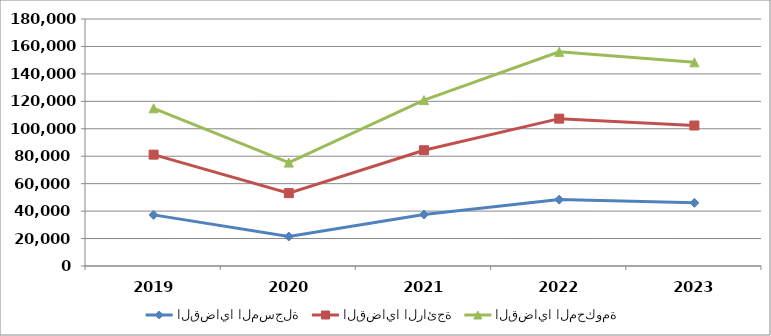
| Category | القضايا المسجلة | القضايا الرائجة | القضايا المحكومة |
|---|---|---|---|
| 2019.0 | 37260 | 43895 | 33755 |
| 2020.0 | 21485 | 31625 | 22248 |
| 2021.0 | 37512 | 46844 | 36530 |
| 2022.0 | 48371 | 59006 | 48678 |
| 2023.0 | 46031 | 56354 | 46020 |